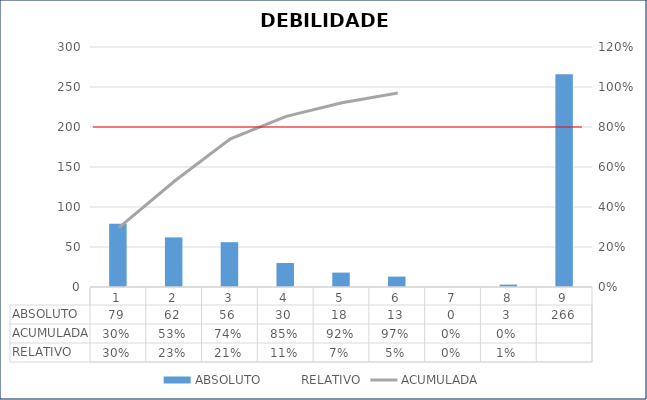
| Category | ABSOLUTO |
|---|---|
| 0 | 79 |
| 1 | 62 |
| 2 | 56 |
| 3 | 30 |
| 4 | 18 |
| 5 | 13 |
| 6 | 0 |
| 7 | 3 |
| 8 | 266 |